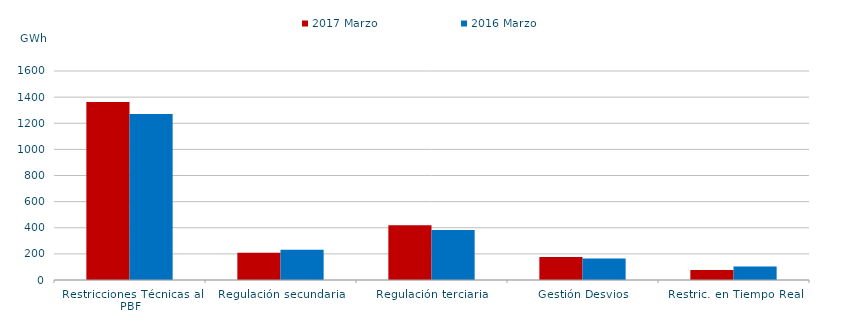
| Category | 2017 | 2016 |
|---|---|---|
| Restricciones Técnicas al PBF | 1362.429 | 1271.019 |
| Regulación secundaria | 207.956 | 232.22 |
| Regulación terciaria | 419.807 | 383.154 |
| Gestión Desvios | 175.148 | 164.182 |
| Restric. en Tiempo Real | 76.975 | 102.863 |